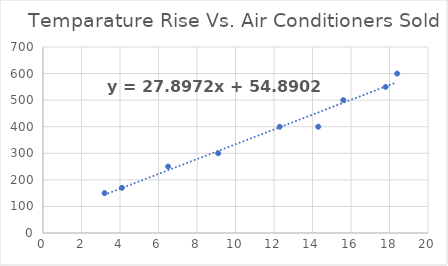
| Category | Series 0 |
|---|---|
| 3.2 | 150 |
| 4.1 | 170 |
| 6.5 | 250 |
| 9.1 | 300 |
| 12.3 | 400 |
| 15.6 | 500 |
| 18.4 | 600 |
| 17.8 | 550 |
| 14.3 | 400 |